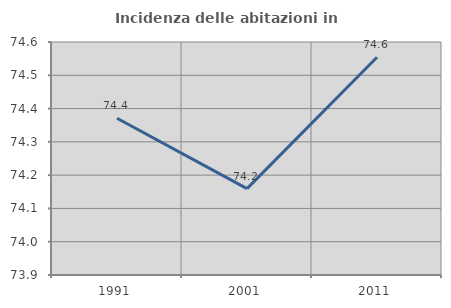
| Category | Incidenza delle abitazioni in proprietà  |
|---|---|
| 1991.0 | 74.371 |
| 2001.0 | 74.159 |
| 2011.0 | 74.554 |